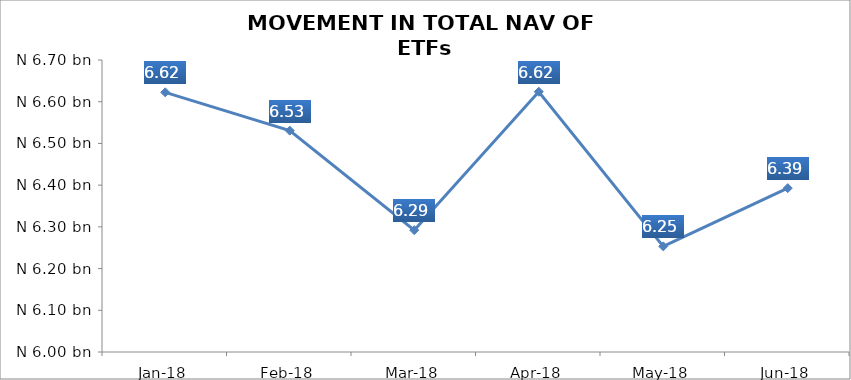
| Category | Series 0 |
|---|---|
| 2018-01-01 | 6622511401.11 |
| 2018-02-01 | 6530678114.87 |
| 2018-03-01 | 6292081212.23 |
| 2018-04-01 | 6623939625.39 |
| 2018-05-01 | 6253239764.9 |
| 2018-06-01 | 6392823777.55 |